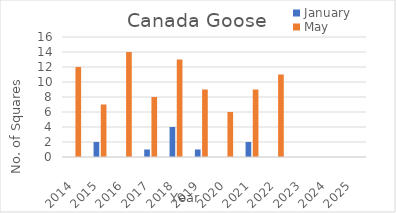
| Category | January | May |
|---|---|---|
| 2014.0 | 0 | 12 |
| 2015.0 | 2 | 7 |
| 2016.0 | 0 | 14 |
| 2017.0 | 1 | 8 |
| 2018.0 | 4 | 13 |
| 2019.0 | 1 | 9 |
| 2020.0 | 0 | 6 |
| 2021.0 | 2 | 9 |
| 2022.0 | 0 | 11 |
| 2023.0 | 0 | 0 |
| 2024.0 | 0 | 0 |
| 2025.0 | 0 | 0 |